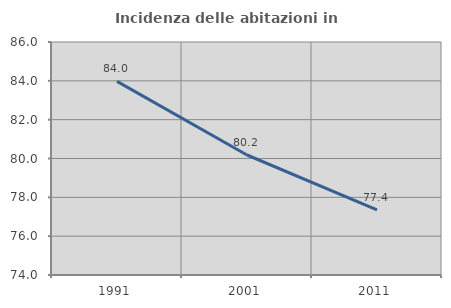
| Category | Incidenza delle abitazioni in proprietà  |
|---|---|
| 1991.0 | 83.975 |
| 2001.0 | 80.18 |
| 2011.0 | 77.352 |